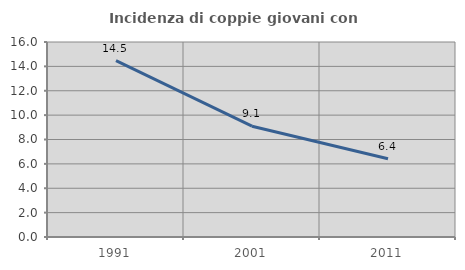
| Category | Incidenza di coppie giovani con figli |
|---|---|
| 1991.0 | 14.465 |
| 2001.0 | 9.091 |
| 2011.0 | 6.415 |